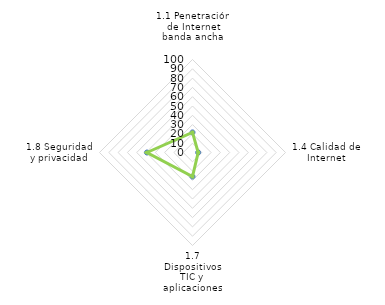
| Category | BOGOTÁ D.C. |
|---|---|
| 1.1 Penetración de Internet banda ancha | 21.62 |
| 1.4 Calidad de Internet | 6.1 |
| 1.7 Dispositivos TIC y aplicaciones | 25.862 |
| 1.8 Seguridad y privacidad | 48.991 |